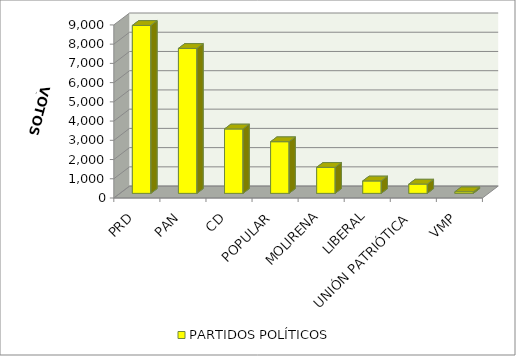
| Category | PARTIDOS POLÍTICOS |
|---|---|
| PRD | 8735 |
| PAN | 7540 |
| CD | 3350 |
| POPULAR | 2688 |
| MOLIRENA | 1355 |
| LIBERAL | 647 |
| UNIÓN PATRIÓTICA | 484 |
| VMP | 83 |